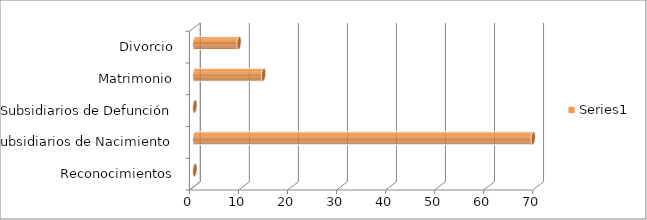
| Category | Series 0 |
|---|---|
| Reconocimientos | 0 |
| Subsidiarios de Nacimiento | 69 |
| Subsidiarios de Defunción | 0 |
| Matrimonio | 14 |
| Divorcio | 9 |